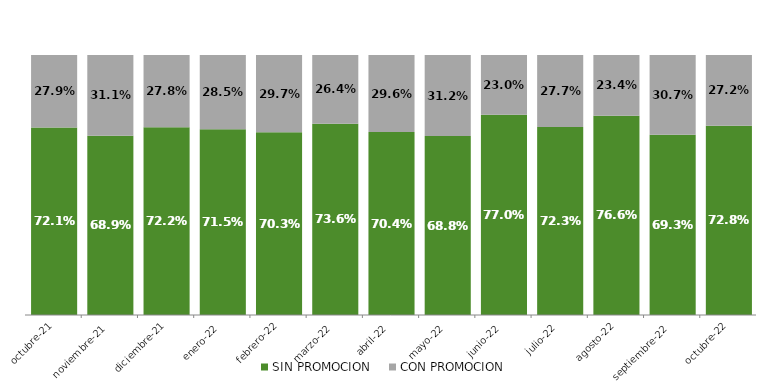
| Category | SIN PROMOCION   | CON PROMOCION   |
|---|---|---|
| 2021-10-01 | 0.721 | 0.279 |
| 2021-11-01 | 0.689 | 0.311 |
| 2021-12-01 | 0.722 | 0.278 |
| 2022-01-01 | 0.715 | 0.285 |
| 2022-02-01 | 0.703 | 0.297 |
| 2022-03-01 | 0.736 | 0.264 |
| 2022-04-01 | 0.704 | 0.296 |
| 2022-05-01 | 0.688 | 0.312 |
| 2022-06-01 | 0.77 | 0.23 |
| 2022-07-01 | 0.723 | 0.277 |
| 2022-08-01 | 0.766 | 0.234 |
| 2022-09-01 | 0.693 | 0.307 |
| 2022-10-01 | 0.728 | 0.272 |